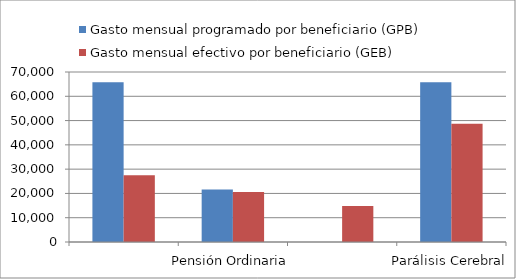
| Category | Gasto mensual programado por beneficiario (GPB)  | Gasto mensual efectivo por beneficiario (GEB)  |
|---|---|---|
|  | 65811.077 | 27495.847 |
| Pensión Ordinaria | 21576.923 | 20627.476 |
|  | 0 | 14796.986 |
| Parálisis Cerebral | 65811.077 | 48721.664 |